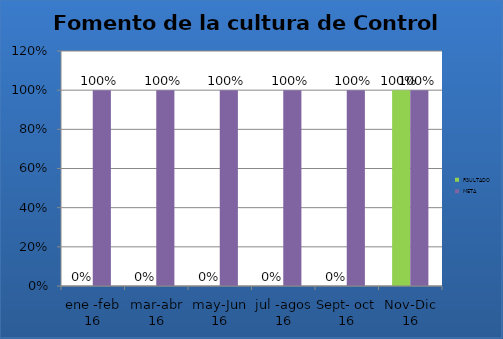
| Category | RSULTADO | META |
|---|---|---|
| ene -feb 16 | 0 | 1 |
| mar-abr 16 | 0 | 1 |
| may-Jun 16 | 0 | 1 |
| jul -agos 16 | 0 | 1 |
| Sept- oct 16 | 0 | 1 |
| Nov-Dic 16 | 1 | 1 |